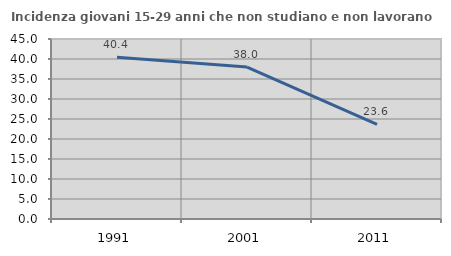
| Category | Incidenza giovani 15-29 anni che non studiano e non lavorano  |
|---|---|
| 1991.0 | 40.439 |
| 2001.0 | 37.993 |
| 2011.0 | 23.64 |